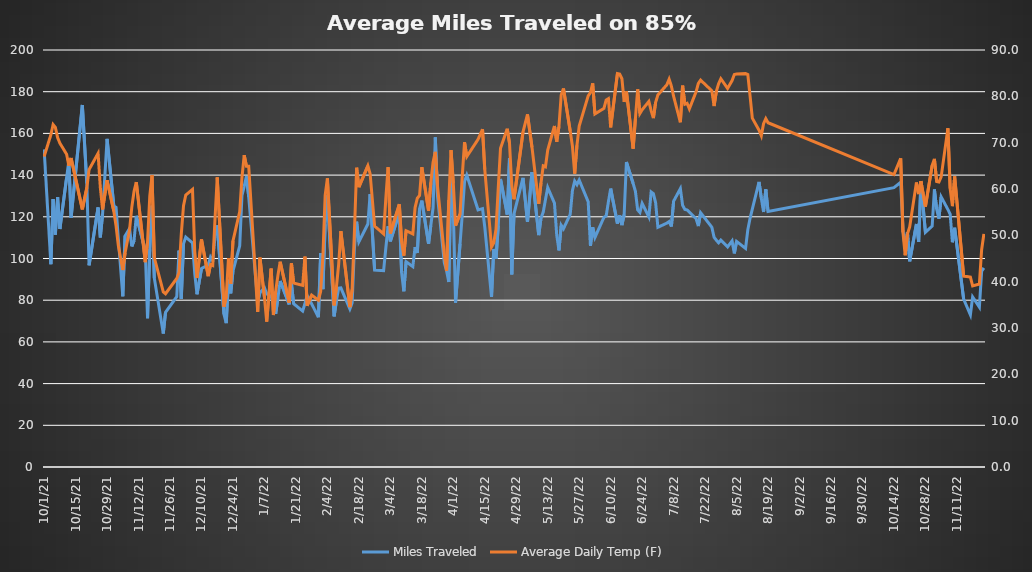
| Category | Miles Traveled |
|---|---|
| 10/1/21 | 152.343 |
| 10/4/21 | 97.267 |
| 10/5/21 | 128.488 |
| 10/6/21 | 111.414 |
| 10/7/21 | 129.436 |
| 10/8/21 | 114.142 |
| 10/11/21 | 138.742 |
| 10/12/21 | 146.759 |
| 10/13/21 | 119.574 |
| 10/18/21 | 173.616 |
| 10/20/21 | 135.992 |
| 10/21/21 | 96.719 |
| 10/25/21 | 124.463 |
| 10/26/21 | 110.089 |
| 10/27/21 | 121.255 |
| 10/29/21 | 157.405 |
| 11/1/21 | 125.169 |
| 11/2/21 | 124.522 |
| 11/3/21 | 109.497 |
| 11/5/21 | 81.887 |
| 11/6/21 | 110.871 |
| 11/8/21 | 114.374 |
| 11/9/21 | 105.805 |
| 11/10/21 | 108.537 |
| 11/11/21 | 120.494 |
| 11/15/21 | 103.771 |
| 11/16/21 | 71.344 |
| 11/17/21 | 104.465 |
| 11/18/21 | 125.373 |
| 11/19/21 | 90.68 |
| 11/23/21 | 64.022 |
| 11/24/21 | 74.213 |
| 11/29/21 | 81.676 |
| 11/30/21 | 103.787 |
| 12/1/21 | 80.629 |
| 12/2/21 | 107.07 |
| 12/3/21 | 110.251 |
| 12/6/21 | 107.455 |
| 12/7/21 | 92.724 |
| 12/8/21 | 82.845 |
| 12/10/21 | 95.204 |
| 12/13/21 | 96.859 |
| 12/14/21 | 100.667 |
| 12/15/21 | 98.896 |
| 12/16/21 | 110.477 |
| 12/17/21 | 115.922 |
| 12/20/21 | 73.263 |
| 12/21/21 | 69.002 |
| 12/22/21 | 89.837 |
| 12/23/21 | 83.315 |
| 12/24/21 | 93.954 |
| 12/27/21 | 106.067 |
| 12/28/21 | 130.264 |
| 12/29/21 | 134.622 |
| 12/30/21 | 139.501 |
| 12/31/21 | 129.572 |
| 1/4/22 | 79.14 |
| 1/5/22 | 83.639 |
| 1/7/22 | 85.946 |
| 1/8/22 | 83.023 |
| 1/10/22 | 81.773 |
| 1/11/22 | 78.073 |
| 1/12/22 | 73.495 |
| 1/13/22 | 81.2 |
| 1/14/22 | 89.201 |
| 1/18/22 | 78.02 |
| 1/19/22 | 88.044 |
| 1/20/22 | 78.296 |
| 1/24/22 | 74.799 |
| 1/25/22 | 78.369 |
| 1/26/22 | 82.175 |
| 1/28/22 | 78.236 |
| 1/31/22 | 71.853 |
| 2/1/22 | 102.521 |
| 2/2/22 | 85.323 |
| 2/3/22 | 116.485 |
| 2/4/22 | 130.334 |
| 2/7/22 | 72.281 |
| 2/8/22 | 79.689 |
| 2/9/22 | 85.767 |
| 2/10/22 | 85.909 |
| 2/14/22 | 75.795 |
| 2/15/22 | 78.627 |
| 2/16/22 | 104.667 |
| 2/17/22 | 117.627 |
| 2/18/22 | 107.977 |
| 2/22/22 | 116.529 |
| 2/23/22 | 130.825 |
| 2/25/22 | 94.399 |
| 3/1/22 | 94.193 |
| 3/2/22 | 105.156 |
| 3/3/22 | 115.486 |
| 3/4/22 | 108.202 |
| 3/8/22 | 122.188 |
| 3/9/22 | 93.332 |
| 3/10/22 | 84.269 |
| 3/11/22 | 98.454 |
| 3/14/22 | 96.099 |
| 3/15/22 | 105.45 |
| 3/16/22 | 102.665 |
| 3/17/22 | 123.904 |
| 3/18/22 | 127.764 |
| 3/21/22 | 107.05 |
| 3/22/22 | 115.836 |
| 3/23/22 | 124.332 |
| 3/24/22 | 158.12 |
| 3/25/22 | 129.826 |
| 3/28/22 | 97.944 |
| 3/29/22 | 94.193 |
| 3/30/22 | 88.769 |
| 3/31/22 | 142.303 |
| 4/1/22 | 123.626 |
| 4/2/22 | 78.811 |
| 4/4/22 | 107.05 |
| 4/5/22 | 121.333 |
| 4/6/22 | 136.889 |
| 4/7/22 | 139.987 |
| 4/12/22 | 123.341 |
| 4/14/22 | 123.925 |
| 4/15/22 | 115.091 |
| 4/18/22 | 81.62 |
| 4/19/22 | 104.535 |
| 4/20/22 | 99.823 |
| 4/21/22 | 115.799 |
| 4/22/22 | 138.106 |
| 4/25/22 | 121.11 |
| 4/26/22 | 148.223 |
| 4/27/22 | 92.379 |
| 4/28/22 | 121.439 |
| 5/2/22 | 138.627 |
| 5/4/22 | 117.549 |
| 5/6/22 | 141.433 |
| 5/9/22 | 111.223 |
| 5/10/22 | 119.329 |
| 5/11/22 | 122.258 |
| 5/12/22 | 128.277 |
| 5/13/22 | 134.051 |
| 5/16/22 | 126.514 |
| 5/17/22 | 111.275 |
| 5/18/22 | 103.889 |
| 5/19/22 | 115.932 |
| 5/20/22 | 114.26 |
| 5/23/22 | 121.181 |
| 5/24/22 | 132.655 |
| 5/25/22 | 137.141 |
| 5/26/22 | 135.428 |
| 5/27/22 | 137.628 |
| 5/31/22 | 127.192 |
| 6/1/22 | 106.03 |
| 6/2/22 | 114.991 |
| 6/3/22 | 110.097 |
| 6/7/22 | 119.742 |
| 6/8/22 | 120.43 |
| 6/9/22 | 127.27 |
| 6/10/22 | 133.526 |
| 6/13/22 | 116.75 |
| 6/14/22 | 120.638 |
| 6/15/22 | 116.022 |
| 6/16/22 | 121.117 |
| 6/17/22 | 146.279 |
| 6/20/22 | 135.969 |
| 6/21/22 | 132.253 |
| 6/22/22 | 123.313 |
| 6/23/22 | 122.069 |
| 6/24/22 | 126.47 |
| 6/27/22 | 119.998 |
| 6/28/22 | 131.917 |
| 6/29/22 | 131.101 |
| 6/30/22 | 126.695 |
| 7/1/22 | 114.962 |
| 7/5/22 | 116.978 |
| 7/6/22 | 117.717 |
| 7/7/22 | 115.343 |
| 7/8/22 | 127.5 |
| 7/11/22 | 133.515 |
| 7/12/22 | 125.52 |
| 7/13/22 | 123.545 |
| 7/14/22 | 123.269 |
| 7/15/22 | 122.22 |
| 7/18/22 | 119.093 |
| 7/19/22 | 115.55 |
| 7/20/22 | 121.969 |
| 7/25/22 | 114.986 |
| 7/26/22 | 110.181 |
| 7/27/22 | 108.772 |
| 7/28/22 | 107.525 |
| 7/29/22 | 108.818 |
| 8/1/22 | 105.541 |
| 8/3/22 | 108.441 |
| 8/4/22 | 102.451 |
| 8/5/22 | 108.181 |
| 8/9/22 | 104.787 |
| 8/10/22 | 113.761 |
| 8/11/22 | 119.275 |
| 8/12/22 | 123.729 |
| 8/15/22 | 136.716 |
| 8/16/22 | 128.951 |
| 8/17/22 | 122.294 |
| 8/18/22 | 133.166 |
| 8/19/22 | 122.567 |
| 10/14/22 | 133.963 |
| 10/17/22 | 136.539 |
| 10/18/22 | 113.952 |
| 10/19/22 | 104.841 |
| 10/20/22 | 112.641 |
| 10/21/22 | 98.636 |
| 10/24/22 | 116.568 |
| 10/25/22 | 107.979 |
| 10/26/22 | 136.692 |
| 10/28/22 | 112.582 |
| 10/31/22 | 115.584 |
| 11/1/22 | 133.136 |
| 11/2/22 | 123.668 |
| 11/3/22 | 119.085 |
| 11/4/22 | 129.551 |
| 11/7/22 | 123.491 |
| 11/8/22 | 121.29 |
| 11/9/22 | 107.804 |
| 11/10/22 | 114.724 |
| 11/14/22 | 80.505 |
| 11/17/22 | 73.022 |
| 11/18/22 | 81.564 |
| 11/21/22 | 76.682 |
| 11/22/22 | 93.861 |
| 11/23/22 | 95.499 |